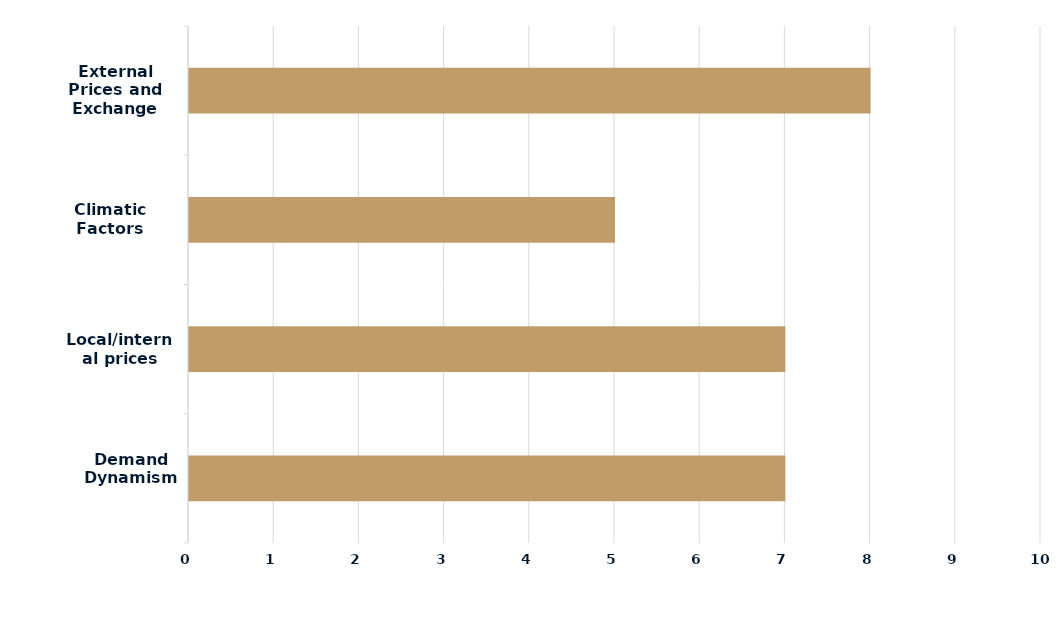
| Category | Series 0 |
|---|---|
| Demand Dynamism | 7 |
| Local/internal prices | 7 |
| Climatic Factors | 5 |
| External Prices and Exchange Rate | 8 |